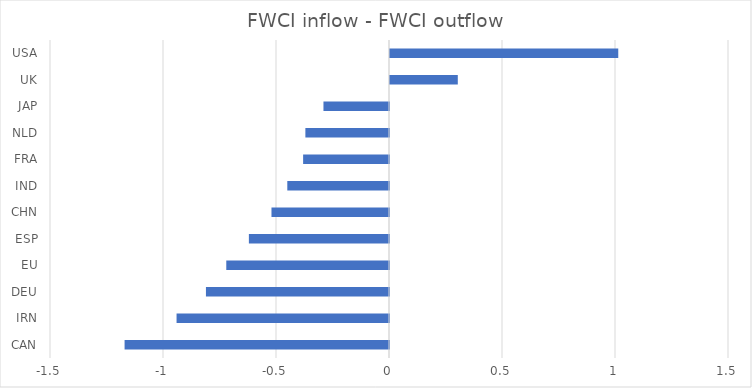
| Category | FWCI inflow - FWCI outflow |
|---|---|
| CAN | -1.17 |
| IRN | -0.94 |
| DEU | -0.81 |
| EU | -0.72 |
| ESP | -0.62 |
| CHN | -0.52 |
| IND | -0.45 |
| FRA | -0.38 |
| NLD | -0.37 |
| JAP | -0.29 |
| UK | 0.3 |
| USA | 1.01 |